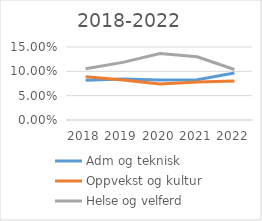
| Category | Adm og teknisk | Oppvekst og kultur | Helse og velferd |
|---|---|---|---|
| 2018 | 0.082 | 0.089 | 0.105 |
| 2019 | 0.084 | 0.082 | 0.118 |
| 2020 | 0.082 | 0.074 | 0.137 |
| 2021 | 0.083 | 0.078 | 0.13 |
| 2022 | 0.097 | 0.08 | 0.104 |